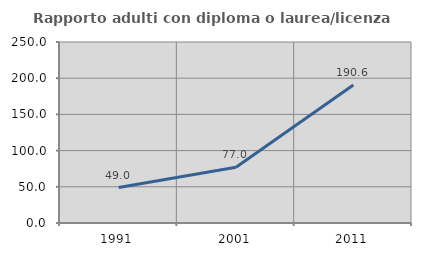
| Category | Rapporto adulti con diploma o laurea/licenza media  |
|---|---|
| 1991.0 | 48.98 |
| 2001.0 | 77.049 |
| 2011.0 | 190.625 |